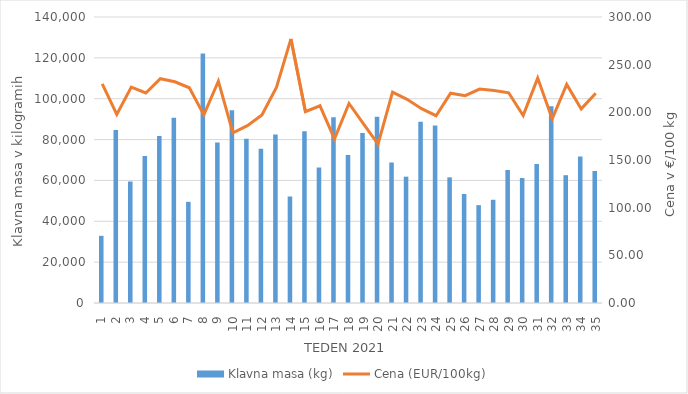
| Category | Klavna masa (kg) |
|---|---|
| 1.0 | 32871 |
| 2.0 | 84639 |
| 3.0 | 59476 |
| 4.0 | 72013 |
| 5.0 | 81759 |
| 6.0 | 90669 |
| 7.0 | 49517 |
| 8.0 | 122111 |
| 9.0 | 78545 |
| 10.0 | 94384 |
| 11.0 | 80405 |
| 12.0 | 75534 |
| 13.0 | 82440 |
| 14.0 | 52143 |
| 15.0 | 84105 |
| 16.0 | 66298 |
| 17.0 | 90925 |
| 18.0 | 72394 |
| 19.0 | 83193 |
| 20.0 | 91231 |
| 21.0 | 68763 |
| 22.0 | 61837 |
| 23.0 | 88747 |
| 24.0 | 86888 |
| 25.0 | 61507 |
| 26.0 | 53379 |
| 27.0 | 47910 |
| 28.0 | 50529 |
| 29.0 | 65062 |
| 30.0 | 61178 |
| 31.0 | 67992 |
| 32.0 | 96308 |
| 33.0 | 62558 |
| 34.0 | 71729 |
| 35.0 | 64596 |